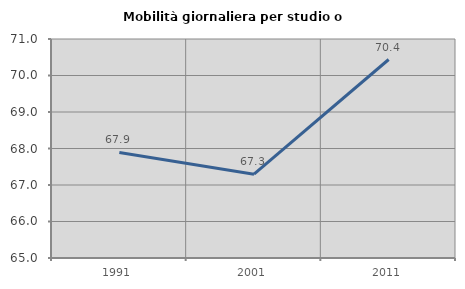
| Category | Mobilità giornaliera per studio o lavoro |
|---|---|
| 1991.0 | 67.893 |
| 2001.0 | 67.295 |
| 2011.0 | 70.438 |